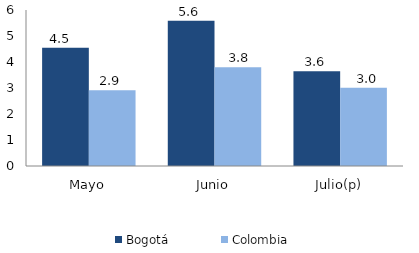
| Category | Bogotá | Colombia |
|---|---|---|
| Mayo | 4.548 | 2.911 |
| Junio | 5.586 | 3.798 |
| Julio(p) | 3.642 | 3.01 |